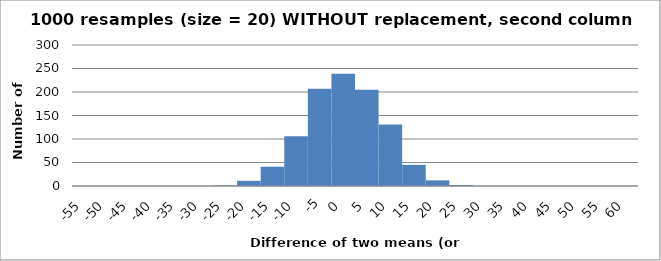
| Category | Number of resamples |
|---|---|
| -55.0 | 0 |
| -50.0 | 0 |
| -45.0 | 0 |
| -40.0 | 0 |
| -35.0 | 0 |
| -30.0 | 0 |
| -25.0 | 1 |
| -20.0 | 11 |
| -15.0 | 41 |
| -10.0 | 106 |
| -5.0 | 207 |
| 0.0 | 239 |
| 5.0 | 205 |
| 10.0 | 131 |
| 15.0 | 45 |
| 20.0 | 12 |
| 25.0 | 2 |
| 30.0 | 0 |
| 35.0 | 0 |
| 40.0 | 0 |
| 45.0 | 0 |
| 50.0 | 0 |
| 55.0 | 0 |
| 60.0 | 0 |